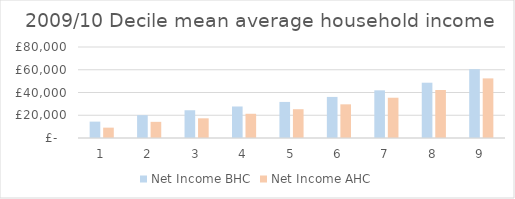
| Category | Net Income BHC | Net Income AHC |
|---|---|---|
| 0 | 14400 | 9100 |
| 1 | 20100 | 14200 |
| 2 | 24400 | 17300 |
| 3 | 27700 | 21300 |
| 4 | 31700 | 25300 |
| 5 | 36100 | 29600 |
| 6 | 41900 | 35400 |
| 7 | 48600 | 42200 |
| 8 | 60500 | 52400 |